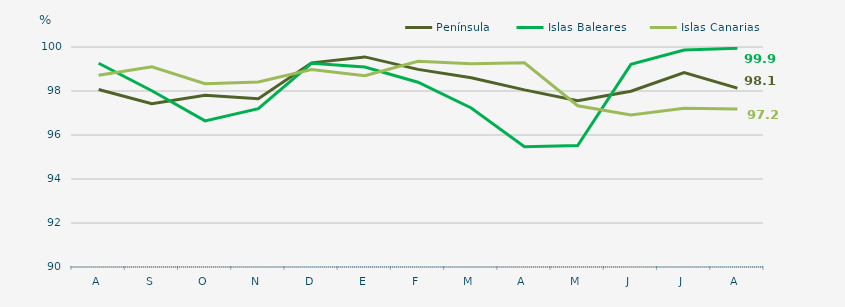
| Category | Península | Islas Baleares | Islas Canarias |
|---|---|---|---|
| A | 98.07 | 99.26 | 98.72 |
| S | 97.42 | 98.01 | 99.1 |
| O | 97.81 | 96.64 | 98.33 |
| N | 97.65 | 97.2 | 98.41 |
| D | 99.28 | 99.26 | 98.98 |
| E | 99.55 | 99.09 | 98.69 |
| F | 98.984 | 98.4 | 99.35 |
| M | 98.6 | 97.23 | 99.24 |
| A | 98.05 | 95.47 | 99.28 |
| M | 97.56 | 95.52 | 97.33 |
| J | 97.99 | 99.21 | 96.91 |
| J | 98.84 | 99.86 | 97.22 |
| A | 98.13 | 99.94 | 97.18 |